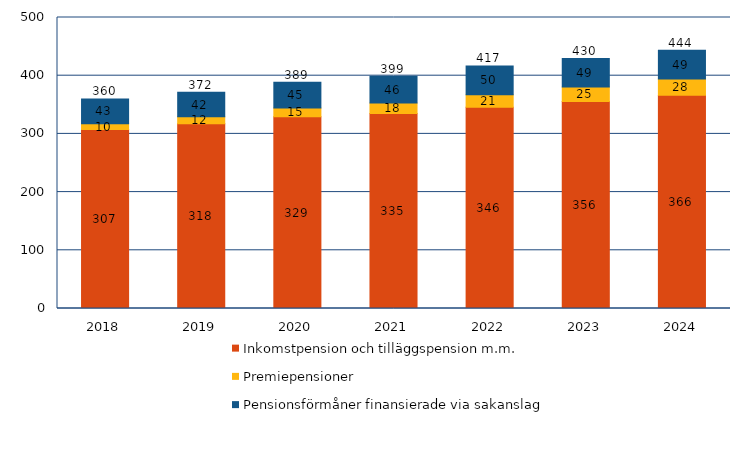
| Category | Inkomstpension och tilläggspension m.m. | Premiepensioner | Pensionsförmåner finansierade via sakanslag | Series 3 |
|---|---|---|---|---|
| 2018.0 | 307.356 | 10.141 | 42.55 | 360.046 |
| 2019.0 | 317.628 | 11.715 | 42.22 | 371.563 |
| 2020.0 | 329.365 | 15.016 | 44.546 | 388.927 |
| 2021.0 | 335.061 | 17.88 | 46.171 | 399.112 |
| 2022.0 | 345.687 | 21.492 | 49.57 | 416.749 |
| 2023.0 | 355.845 | 24.601 | 49.282 | 429.728 |
| 2024.0 | 366.444 | 27.951 | 49.348 | 443.743 |